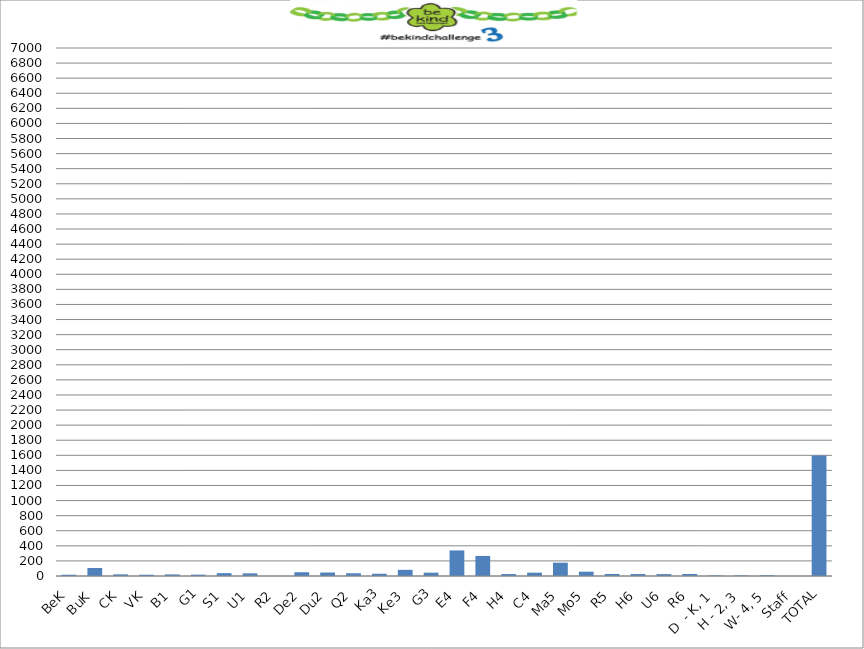
| Category | Series 0 |
|---|---|
| BeK | 17 |
| BuK | 106 |
| CK | 22 |
| VK | 17 |
| B1 | 21 |
| G1 | 18 |
| S1 | 38 |
| U1 | 35 |
| R2 | 0 |
| De2 | 50 |
| Du2 | 46 |
| Q2 | 36 |
| Ka3 | 30 |
| Ke3 | 82 |
| G3 | 44 |
| E4 | 339 |
| F4 | 266 |
| H4 | 26 |
| C4 | 44 |
| Ma5 | 176 |
| Mo5 | 57 |
| R5 | 27 |
| H6 | 26 |
| U6 | 25 |
| R6 | 27 |
| D  - K, 1 | 7 |
| H - 2, 3 | 7 |
| W- 4, 5 | 10 |
| Staff | 0 |
| TOTAL | 1599 |